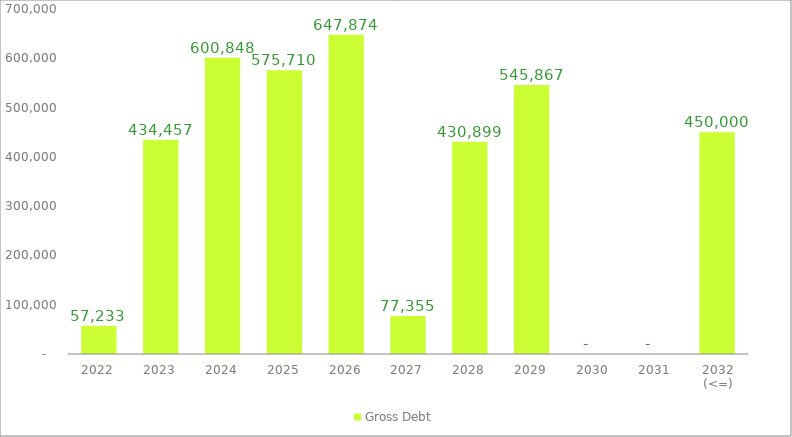
| Category | Gross Debt |
|---|---|
| 2022 | 57232.948 |
| 2023 | 434456.951 |
| 2024 | 600847.985 |
| 2025 | 575709.854 |
| 2026 | 647873.721 |
| 2027 | 77354.957 |
| 2028 | 430899.316 |
| 2029 | 545867.35 |
| 2030 | 0 |
| 2031 | 0 |
| 2032 (<=) | 450000 |